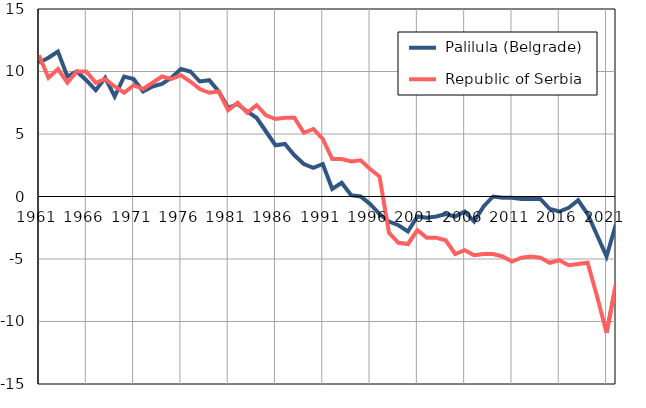
| Category |  Palilula (Belgrade) |  Republic of Serbia |
|---|---|---|
| 1961.0 | 10.7 | 11.3 |
| 1962.0 | 11.1 | 9.5 |
| 1963.0 | 11.6 | 10.2 |
| 1964.0 | 9.6 | 9.1 |
| 1965.0 | 10 | 10 |
| 1966.0 | 9.3 | 10 |
| 1967.0 | 8.5 | 9.1 |
| 1968.0 | 9.5 | 9.4 |
| 1969.0 | 8 | 8.8 |
| 1970.0 | 9.6 | 8.3 |
| 1971.0 | 9.4 | 8.9 |
| 1972.0 | 8.4 | 8.6 |
| 1973.0 | 8.8 | 9.1 |
| 1974.0 | 9 | 9.6 |
| 1975.0 | 9.5 | 9.4 |
| 1976.0 | 10.2 | 9.7 |
| 1977.0 | 10 | 9.2 |
| 1978.0 | 9.2 | 8.6 |
| 1979.0 | 9.3 | 8.3 |
| 1980.0 | 8.4 | 8.4 |
| 1981.0 | 7.1 | 6.9 |
| 1982.0 | 7.4 | 7.5 |
| 1983.0 | 6.8 | 6.7 |
| 1984.0 | 6.3 | 7.3 |
| 1985.0 | 5.2 | 6.5 |
| 1986.0 | 4.1 | 6.2 |
| 1987.0 | 4.2 | 6.3 |
| 1988.0 | 3.3 | 6.3 |
| 1989.0 | 2.6 | 5.1 |
| 1990.0 | 2.3 | 5.4 |
| 1991.0 | 2.6 | 4.6 |
| 1992.0 | 0.6 | 3 |
| 1993.0 | 1.1 | 3 |
| 1994.0 | 0.1 | 2.8 |
| 1995.0 | 0 | 2.9 |
| 1996.0 | -0.6 | 2.2 |
| 1997.0 | -1.4 | 1.6 |
| 1998.0 | -2 | -2.9 |
| 1999.0 | -2.3 | -3.7 |
| 2000.0 | -2.8 | -3.8 |
| 2001.0 | -1.6 | -2.7 |
| 2002.0 | -1.7 | -3.3 |
| 2003.0 | -1.6 | -3.3 |
| 2004.0 | -1.4 | -3.5 |
| 2005.0 | -1.6 | -4.6 |
| 2006.0 | -1.2 | -4.3 |
| 2007.0 | -2 | -4.7 |
| 2008.0 | -0.8 | -4.6 |
| 2009.0 | 0 | -4.6 |
| 2010.0 | -0.1 | -4.8 |
| 2011.0 | -0.1 | -5.2 |
| 2012.0 | -0.2 | -4.9 |
| 2013.0 | -0.2 | -4.8 |
| 2014.0 | -0.2 | -4.9 |
| 2015.0 | -1 | -5.3 |
| 2016.0 | -1.2 | -5.1 |
| 2017.0 | -0.9 | -5.5 |
| 2018.0 | -0.3 | -5.4 |
| 2019.0 | -1.4 | -5.3 |
| 2020.0 | -3.1 | -8 |
| 2021.0 | -4.8 | -10.9 |
| 2022.0 | -2.2 | -7 |